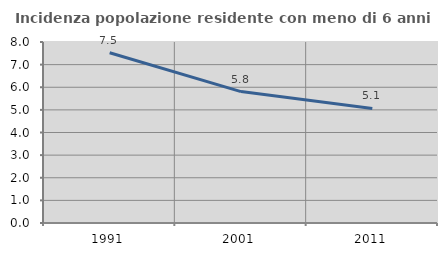
| Category | Incidenza popolazione residente con meno di 6 anni |
|---|---|
| 1991.0 | 7.526 |
| 2001.0 | 5.809 |
| 2011.0 | 5.065 |